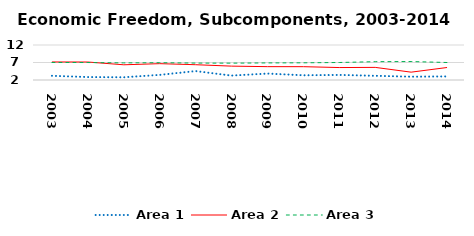
| Category | Area 1 | Area 2 | Area 3 |
|---|---|---|---|
| 2003.0 | 3.197 | 7.156 | 7.008 |
| 2004.0 | 2.839 | 7.137 | 6.992 |
| 2005.0 | 2.779 | 6.346 | 6.889 |
| 2006.0 | 3.461 | 6.667 | 6.944 |
| 2007.0 | 4.548 | 6.367 | 6.836 |
| 2008.0 | 3.26 | 5.961 | 6.814 |
| 2009.0 | 3.842 | 5.815 | 6.882 |
| 2010.0 | 3.348 | 5.807 | 6.913 |
| 2011.0 | 3.449 | 5.557 | 6.999 |
| 2012.0 | 3.205 | 5.603 | 7.236 |
| 2013.0 | 2.944 | 4.237 | 7.274 |
| 2014.0 | 3.024 | 5.569 | 6.998 |